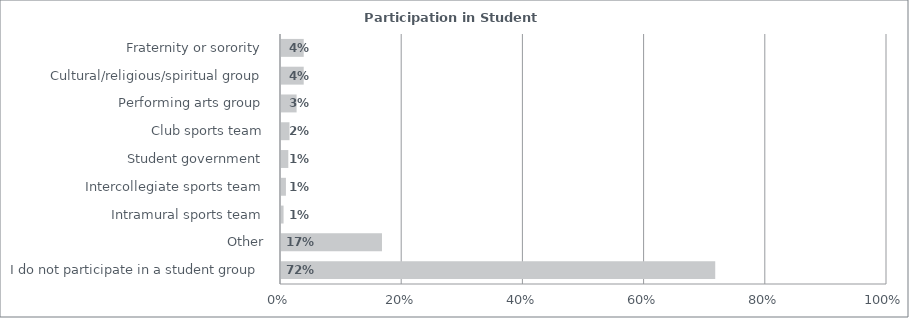
| Category | Series 0 |
|---|---|
| I do not participate in a student group | 0.718 |
| Other | 0.168 |
| Intramural sports team | 0.006 |
| Intercollegiate sports team | 0.01 |
| Student government | 0.014 |
| Club sports team | 0.016 |
| Performing arts group | 0.027 |
| Cultural/religious/spiritual group | 0.039 |
| Fraternity or sorority | 0.039 |